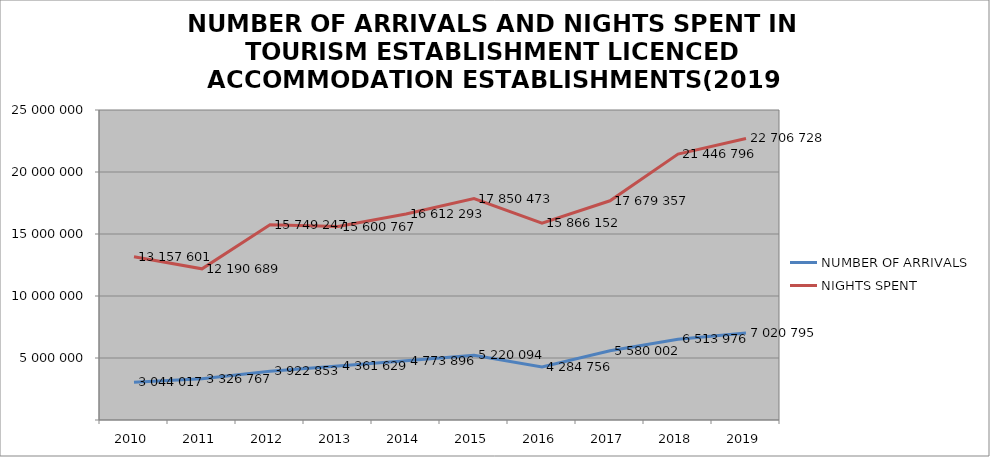
| Category | NUMBER OF ARRIVALS | NIGHTS SPENT |
|---|---|---|
| 2010 | 3044017 | 13157601 |
| 2011 | 3326767 | 12190689 |
| 2012 | 3922853 | 15749247 |
| 2013 | 4361629 | 15600767 |
| 2014 | 4773896 | 16612293 |
| 2015 | 5220094 | 17850473 |
| 2016 | 4284756 | 15866152 |
| 2017 | 5580002 | 17679357 |
| 2018 | 6513976 | 21446796 |
| 2019 | 7020795 | 22706728 |